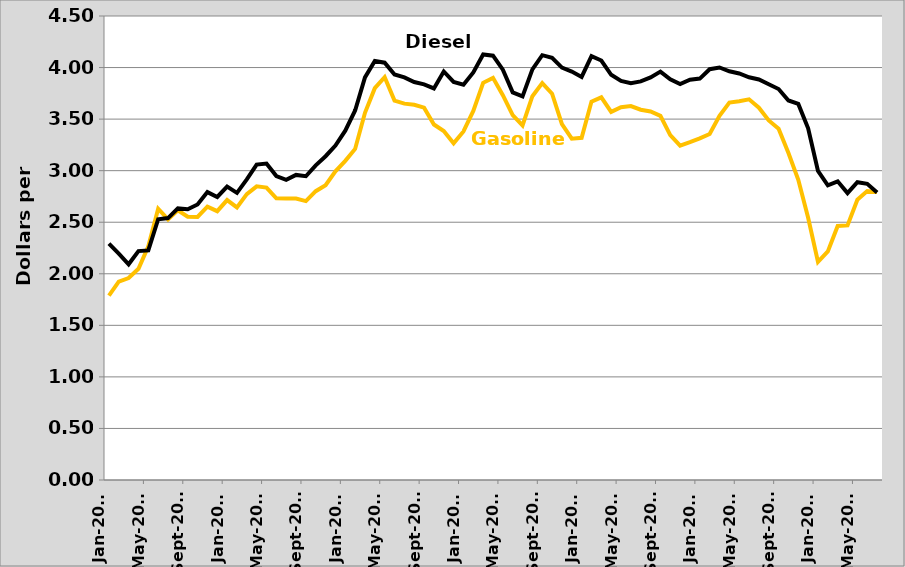
| Category | Gasoline | Diesel |
|---|---|---|
| 2009-01-01 | 1.788 | 2.292 |
| 2009-02-01 | 1.923 | 2.195 |
| 2009-03-01 | 1.959 | 2.092 |
| 2009-04-01 | 2.049 | 2.22 |
| 2009-05-01 | 2.266 | 2.227 |
| 2009-06-01 | 2.631 | 2.529 |
| 2009-07-01 | 2.527 | 2.54 |
| 2009-08-01 | 2.616 | 2.634 |
| 2009-09-01 | 2.554 | 2.626 |
| 2009-10-01 | 2.551 | 2.672 |
| 2009-11-01 | 2.651 | 2.792 |
| 2009-12-01 | 2.607 | 2.745 |
| 2010-01-01 | 2.715 | 2.845 |
| 2010-02-01 | 2.644 | 2.785 |
| 2010-03-01 | 2.772 | 2.915 |
| 2010-04-01 | 2.848 | 3.059 |
| 2010-05-01 | 2.836 | 3.069 |
| 2010-06-01 | 2.732 | 2.948 |
| 2010-07-01 | 2.729 | 2.911 |
| 2010-08-01 | 2.73 | 2.959 |
| 2010-09-01 | 2.705 | 2.946 |
| 2010-10-01 | 2.801 | 3.052 |
| 2010-11-01 | 2.859 | 3.14 |
| 2010-12-01 | 2.993 | 3.243 |
| 2011-01-01 | 3.095 | 3.388 |
| 2011-02-01 | 3.211 | 3.584 |
| 2011-03-01 | 3.561 | 3.905 |
| 2011-04-01 | 3.8 | 4.064 |
| 2011-05-01 | 3.906 | 4.047 |
| 2011-06-01 | 3.68 | 3.933 |
| 2011-07-01 | 3.65 | 3.905 |
| 2011-08-01 | 3.639 | 3.86 |
| 2011-09-01 | 3.611 | 3.837 |
| 2011-10-01 | 3.448 | 3.798 |
| 2011-11-01 | 3.384 | 3.962 |
| 2011-12-01 | 3.266 | 3.861 |
| 2012-01-01 | 3.38 | 3.833 |
| 2012-02-01 | 3.579 | 3.953 |
| 2012-03-01 | 3.852 | 4.127 |
| 2012-04-01 | 3.9 | 4.115 |
| 2012-05-01 | 3.732 | 3.979 |
| 2012-06-01 | 3.539 | 3.759 |
| 2012-07-01 | 3.439 | 3.721 |
| 2012-08-01 | 3.722 | 3.983 |
| 2012-09-01 | 3.849 | 4.12 |
| 2012-10-01 | 3.746 | 4.094 |
| 2012-11-01 | 3.452 | 4 |
| 2012-12-01 | 3.31 | 3.961 |
| 2013-01-01 | 3.319 | 3.909 |
| 2013-02-01 | 3.67 | 4.111 |
| 2013-03-01 | 3.711 | 4.068 |
| 2013-04-01 | 3.57 | 3.93 |
| 2013-05-01 | 3.615 | 3.87 |
| 2013-06-01 | 3.626 | 3.849 |
| 2013-07-01 | 3.591 | 3.866 |
| 2013-08-01 | 3.574 | 3.905 |
| 2013-09-01 | 3.532 | 3.961 |
| 2013-10-01 | 3.344 | 3.885 |
| 2013-11-01 | 3.243 | 3.839 |
| 2013-12-01 | 3.276 | 3.882 |
| 2014-01-01 | 3.313 | 3.893 |
| 2014-02-01 | 3.356 | 3.984 |
| 2014-03-01 | 3.533 | 4.001 |
| 2014-04-01 | 3.661 | 3.964 |
| 2014-05-01 | 3.673 | 3.943 |
| 2014-06-01 | 3.692 | 3.906 |
| 2014-07-01 | 3.611 | 3.884 |
| 2014-08-01 | 3.487 | 3.838 |
| 2014-09-01 | 3.406 | 3.792 |
| 2014-10-01 | 3.171 | 3.681 |
| 2014-11-01 | 2.912 | 3.647 |
| 2014-12-01 | 2.543 | 3.411 |
| 2015-01-01 | 2.116 | 2.997 |
| 2015-02-01 | 2.216 | 2.858 |
| 2015-03-01 | 2.464 | 2.897 |
| 2015-04-01 | 2.469 | 2.782 |
| 2015-05-01 | 2.718 | 2.888 |
| 2015-06-01 | 2.802 | 2.873 |
| 2015-07-01 | 2.794 | 2.788 |